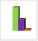
| Category | област Разград |
|---|---|
| летен сезон 2019  | 24997 |
| летен сезон 2021  | 22917 |
| летен сезон 2022 г.  | 21232 |